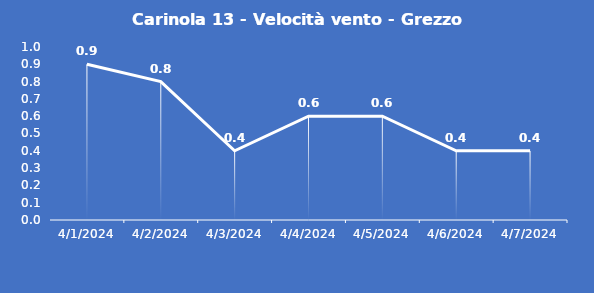
| Category | Carinola 13 - Velocità vento - Grezzo (m/s) |
|---|---|
| 4/1/24 | 0.9 |
| 4/2/24 | 0.8 |
| 4/3/24 | 0.4 |
| 4/4/24 | 0.6 |
| 4/5/24 | 0.6 |
| 4/6/24 | 0.4 |
| 4/7/24 | 0.4 |